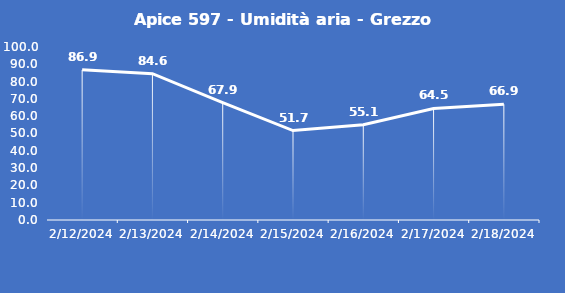
| Category | Apice 597 - Umidità aria - Grezzo (%) |
|---|---|
| 2/12/24 | 86.9 |
| 2/13/24 | 84.6 |
| 2/14/24 | 67.9 |
| 2/15/24 | 51.7 |
| 2/16/24 | 55.1 |
| 2/17/24 | 64.5 |
| 2/18/24 | 66.9 |